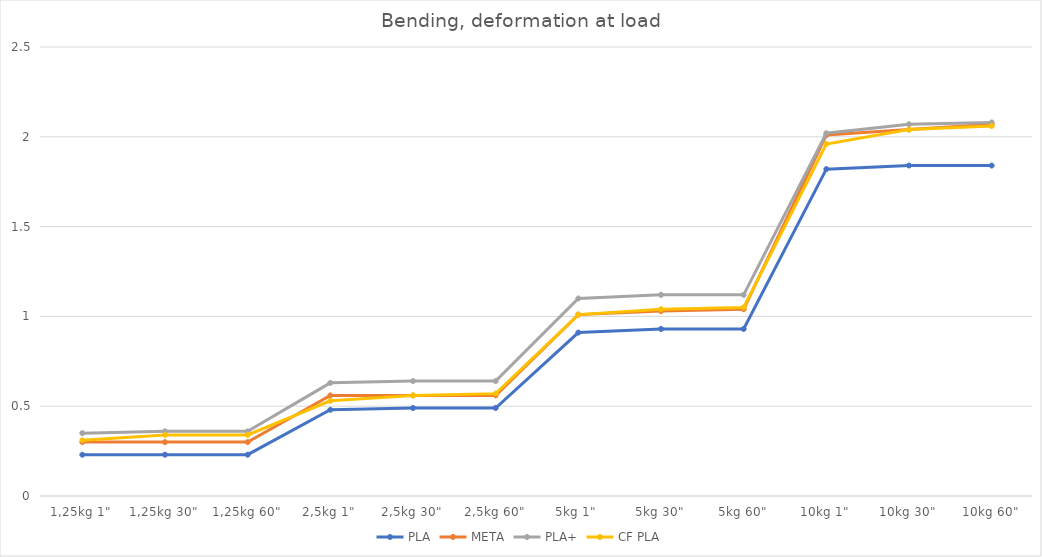
| Category | PLA | META | PLA+ | CF PLA |
|---|---|---|---|---|
| 1,25kg 1" | 0.23 | 0.3 | 0.35 | 0.31 |
| 1,25kg 30" | 0.23 | 0.3 | 0.36 | 0.34 |
| 1,25kg 60" | 0.23 | 0.3 | 0.36 | 0.34 |
| 2,5kg 1" | 0.48 | 0.56 | 0.63 | 0.53 |
| 2,5kg 30" | 0.49 | 0.56 | 0.64 | 0.56 |
| 2,5kg 60" | 0.49 | 0.56 | 0.64 | 0.57 |
| 5kg 1" | 0.91 | 1.01 | 1.1 | 1.01 |
| 5kg 30" | 0.93 | 1.03 | 1.12 | 1.04 |
| 5kg 60" | 0.93 | 1.04 | 1.12 | 1.05 |
| 10kg 1" | 1.82 | 2.01 | 2.02 | 1.96 |
| 10kg 30" | 1.84 | 2.04 | 2.07 | 2.04 |
| 10kg 60" | 1.84 | 2.07 | 2.08 | 2.06 |